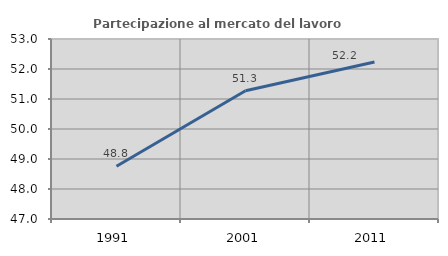
| Category | Partecipazione al mercato del lavoro  femminile |
|---|---|
| 1991.0 | 48.761 |
| 2001.0 | 51.275 |
| 2011.0 | 52.233 |